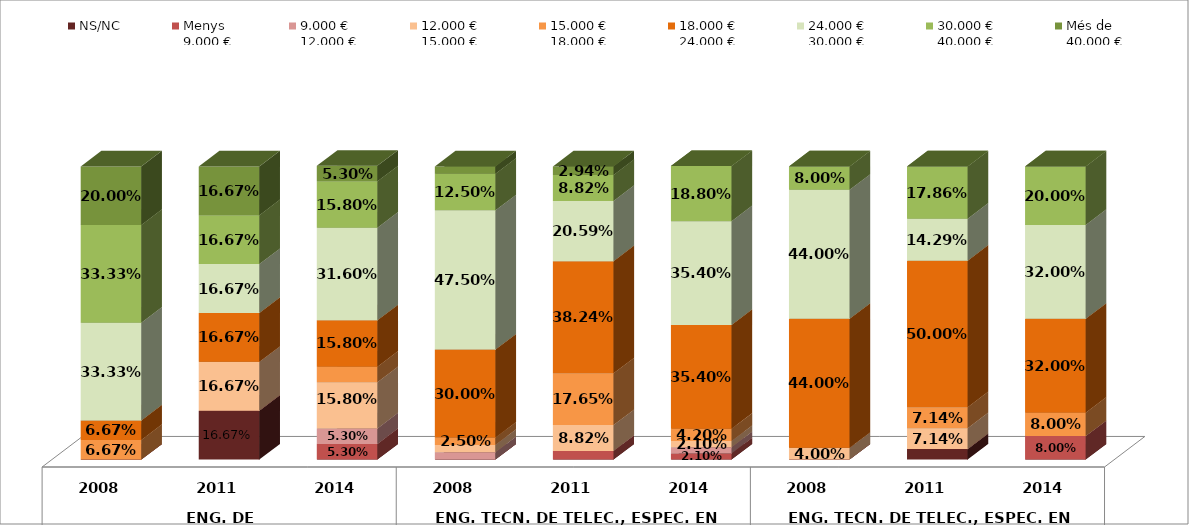
| Category | NS/NC | Menys 
9.000 € | 9.000 €
12.000 € | 12.000 €
15.000 € | 15.000 €
18.000 € | 18.000 €
24.000 € | 24.000 €
30.000 € | 30.000 €
40.000 € | Més de 
40.000 € |
|---|---|---|---|---|---|---|---|---|---|
| 0 | 0 | 0 | 0 | 0 | 0.067 | 0.067 | 0.333 | 0.333 | 0.2 |
| 1 | 0.167 | 0 | 0 | 0.167 | 0 | 0.167 | 0.167 | 0.167 | 0.167 |
| 2 | 0 | 0.053 | 0.053 | 0.158 | 0.053 | 0.158 | 0.316 | 0.158 | 0.053 |
| 3 | 0 | 0 | 0.025 | 0.025 | 0.025 | 0.3 | 0.475 | 0.125 | 0.025 |
| 4 | 0 | 0.029 | 0 | 0.088 | 0.176 | 0.382 | 0.206 | 0.088 | 0.029 |
| 5 | 0 | 0.021 | 0.021 | 0.021 | 0.042 | 0.354 | 0.354 | 0.188 | 0 |
| 6 | 0 | 0 | 0 | 0.04 | 0 | 0.44 | 0.44 | 0.08 | 0 |
| 7 | 0.036 | 0 | 0 | 0.071 | 0.071 | 0.5 | 0.143 | 0.179 | 0 |
| 8 | 0 | 0.08 | 0 | 0 | 0.08 | 0.32 | 0.32 | 0.2 | 0 |